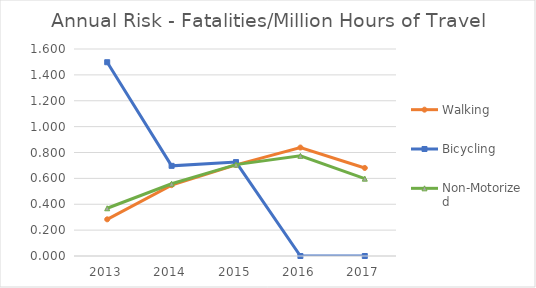
| Category | Walking | Bicycling | Non-Motorized |
|---|---|---|---|
| 2013 | 0.283 | 1.498 | 0.369 |
| 2014 | 0.548 | 0.697 | 0.558 |
| 2015 | 0.704 | 0.726 | 0.706 |
| 2016 | 0.838 | 0 | 0.774 |
| 2017 | 0.681 | 0 | 0.598 |